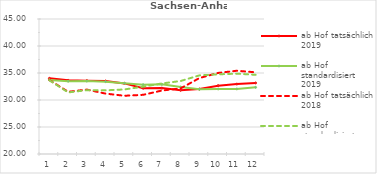
| Category | ab Hof tatsächlich 2019 | ab Hof standardisiert 2019 | ab Hof tatsächlich 2018 | ab Hof standardisiert 2018 |
|---|---|---|---|---|
| 0 | 34.008 | 33.722 | 33.702 | 33.665 |
| 1 | 33.645 | 33.479 | 31.516 | 31.403 |
| 2 | 33.586 | 33.511 | 31.93 | 31.82 |
| 3 | 33.517 | 33.402 | 31.182 | 31.788 |
| 4 | 33.073 | 33.098 | 30.783 | 31.955 |
| 5 | 32.184 | 32.835 | 30.959 | 32.471 |
| 6 | 32.204 | 32.903 | 31.751 | 33.062 |
| 7 | 31.8 | 32.4 | 32.146 | 33.518 |
| 8 | 32.028 | 31.979 | 34.06 | 34.559 |
| 9 | 32.659 | 32.037 | 35.012 | 34.758 |
| 10 | 32.946 | 32.05 | 35.42 | 34.879 |
| 11 | 33.156 | 32.34 | 35.129 | 34.661 |